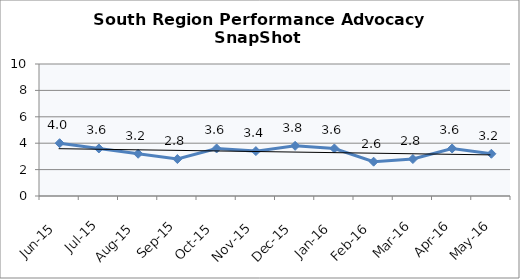
| Category | South Region |
|---|---|
| Jun-15 | 4 |
| Jul-15 | 3.6 |
| Aug-15 | 3.2 |
| Sep-15 | 2.8 |
| Oct-15 | 3.6 |
| Nov-15 | 3.4 |
| Dec-15 | 3.8 |
| Jan-16 | 3.6 |
| Feb-16 | 2.6 |
| Mar-16 | 2.8 |
| Apr-16 | 3.6 |
| May-16 | 3.2 |